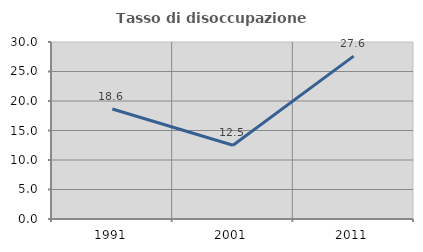
| Category | Tasso di disoccupazione giovanile  |
|---|---|
| 1991.0 | 18.639 |
| 2001.0 | 12.5 |
| 2011.0 | 27.609 |